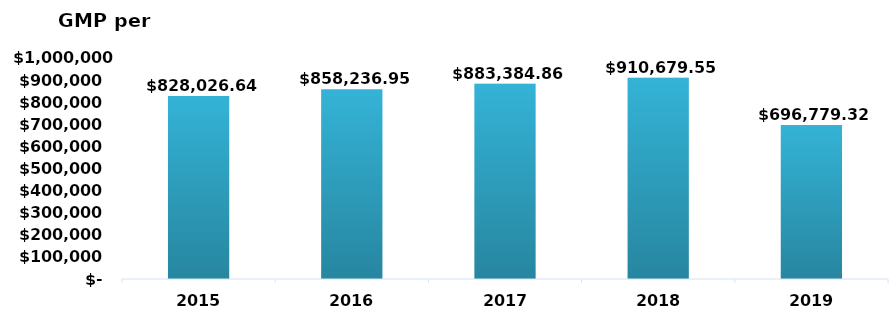
| Category | Total |
|---|---|
| 2015 | 828026638.67 |
| 2016 | 858236950.18 |
| 2017 | 883384864.92 |
| 2018 | 910679549.08 |
| 2019 | 696779320.47 |